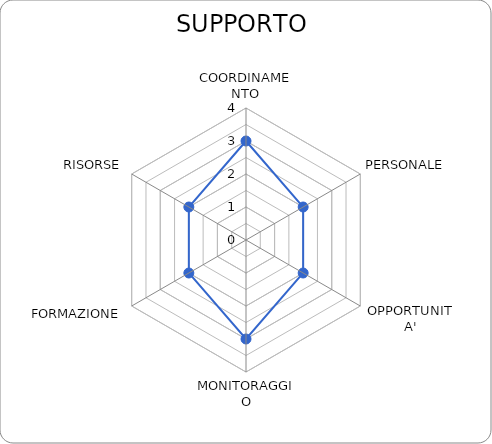
| Category | Series 0 |
|---|---|
| COORDINAMENTO | 3 |
| PERSONALE | 2 |
| OPPORTUNITA' | 2 |
| MONITORAGGIO | 3 |
| FORMAZIONE | 2 |
| RISORSE | 2 |